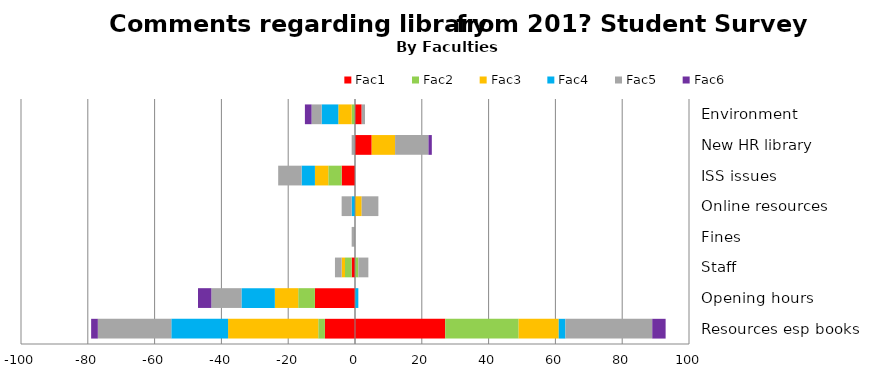
| Category | Fac1 | Fac2 | #REF! | Fac3 | Fac4 | Fac5 | Fac6 |
|---|---|---|---|---|---|---|---|
| Resources esp books  | -9 | 22 | -2 | -27 | -17 | -22 | -2 |
| Opening hours | -12 | 0 | -5 | -7 | -10 | -9 | -4 |
| Staff  | -1 | 1 | -2 | -1 | 0 | -2 | 0 |
| Fines  | 0 | 0 | 0 | 0 | 0 | -1 | 0 |
| Online resources  | 0 | 0 | 0 | 0 | -1 | -3 | 0 |
| ISS issues | -4 | 0 | -4 | -4 | -4 | -7 | 0 |
| New HR library | 0 | 0 | 0 | 0 | 0 | -1 | 0 |
| Environment  | 0 | 0 | -1 | -4 | -5 | -3 | -2 |